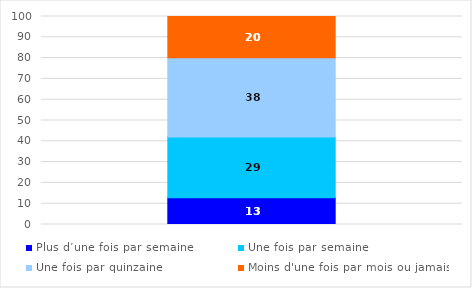
| Category | Plus d’une fois par semaine   | Une fois par semaine | Une fois par quinzaine | Moins d'une fois par mois ou jamais |
|---|---|---|---|---|
| 0 | 12.909 | 29.159 | 38.147 | 19.785 |